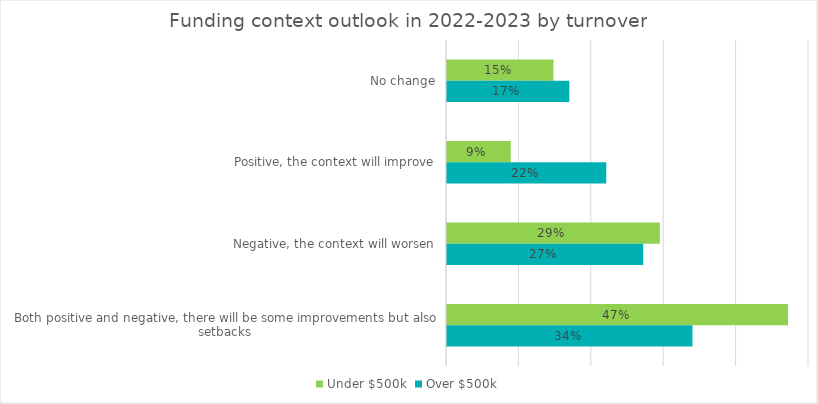
| Category | Under $500k | Over $500k |
|---|---|---|
| No change | 0.147 | 0.169 |
| Positive, the context will improve | 0.088 | 0.22 |
| Negative, the context will worsen | 0.294 | 0.271 |
| Both positive and negative, there will be some improvements but also setbacks | 0.471 | 0.339 |